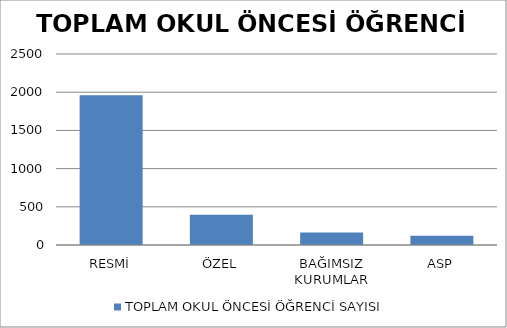
| Category | TOPLAM OKUL ÖNCESİ ÖĞRENCİ SAYISI |
|---|---|
| RESMİ | 1959 |
| ÖZEL | 397 |
| BAĞIMSIZ KURUMLAR | 163 |
| ASP | 121 |